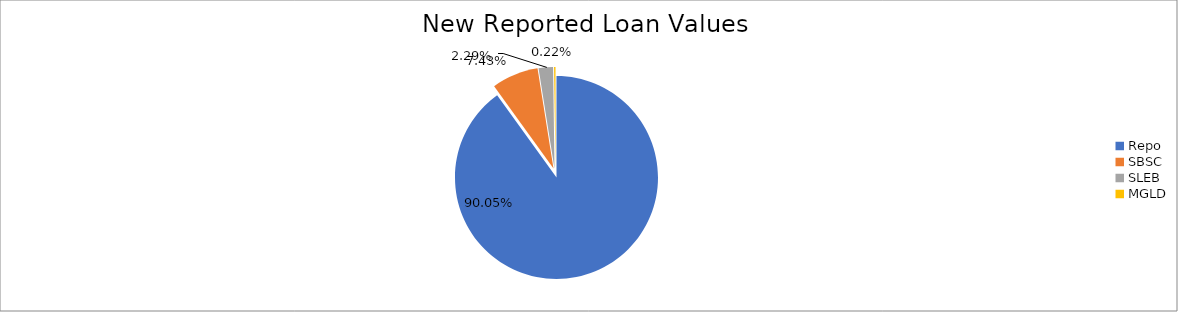
| Category | Series 0 |
|---|---|
| Repo | 11419575.918 |
| SBSC | 942034.216 |
| SLEB | 290797.711 |
| MGLD | 28266.023 |